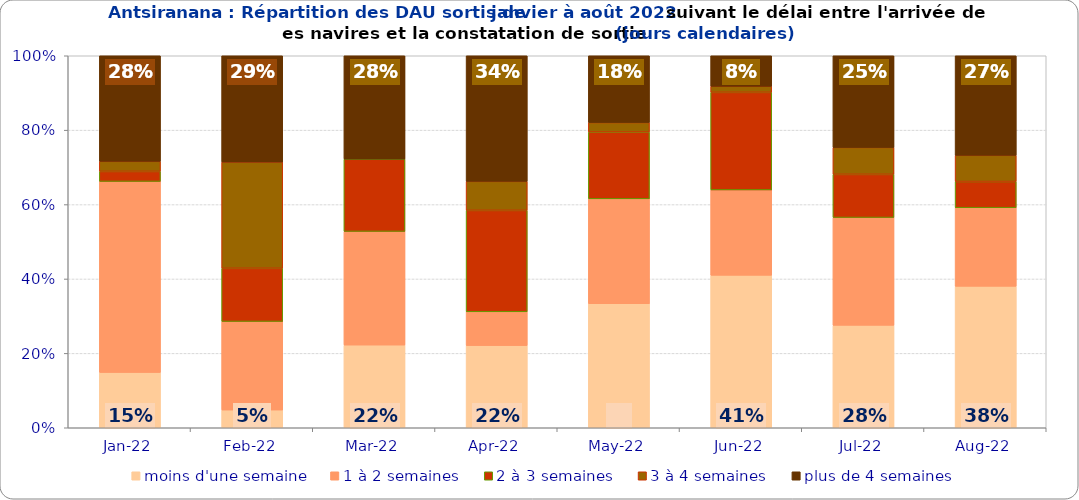
| Category | moins d'une semaine | 1 à 2 semaines | 2 à 3 semaines | 3 à 4 semaines | plus de 4 semaines |
|---|---|---|---|---|---|
| 2022-01-01 | 0.149 | 0.514 | 0.027 | 0.027 | 0.284 |
| 2022-02-01 | 0.048 | 0.238 | 0.143 | 0.286 | 0.286 |
| 2022-03-01 | 0.222 | 0.306 | 0.194 | 0 | 0.278 |
| 2022-04-01 | 0.221 | 0.091 | 0.273 | 0.078 | 0.338 |
| 2022-05-01 | 0.333 | 0.282 | 0.179 | 0.026 | 0.179 |
| 2022-06-01 | 0.41 | 0.23 | 0.262 | 0.016 | 0.082 |
| 2022-07-01 | 0.275 | 0.29 | 0.116 | 0.072 | 0.246 |
| 2022-08-01 | 0.38 | 0.211 | 0.07 | 0.07 | 0.268 |